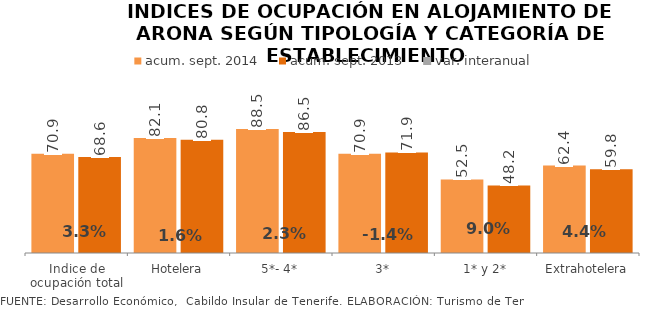
| Category | acum. sept. 2014 | acum. sept. 2013 |
|---|---|---|
| Indice de ocupación total | 70.868 | 68.584 |
| Hotelera | 82.108 | 80.819 |
| 5*- 4* | 88.517 | 86.518 |
| 3* | 70.884 | 71.873 |
| 1* y 2* | 52.547 | 48.223 |
| Extrahotelera | 62.421 | 59.817 |